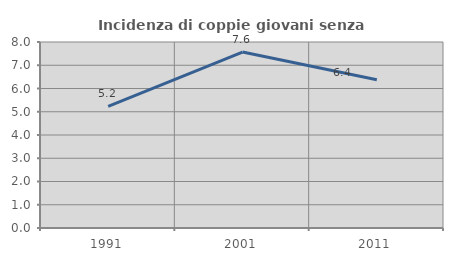
| Category | Incidenza di coppie giovani senza figli |
|---|---|
| 1991.0 | 5.231 |
| 2001.0 | 7.568 |
| 2011.0 | 6.378 |